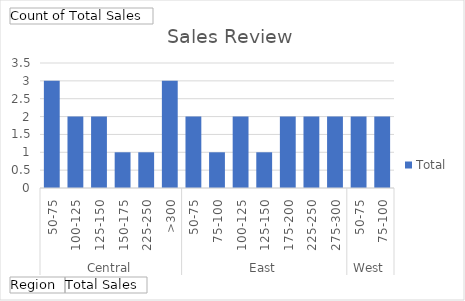
| Category | Total |
|---|---|
| 0 | 3 |
| 1 | 2 |
| 2 | 2 |
| 3 | 1 |
| 4 | 1 |
| 5 | 3 |
| 6 | 2 |
| 7 | 1 |
| 8 | 2 |
| 9 | 1 |
| 10 | 2 |
| 11 | 2 |
| 12 | 2 |
| 13 | 2 |
| 14 | 2 |